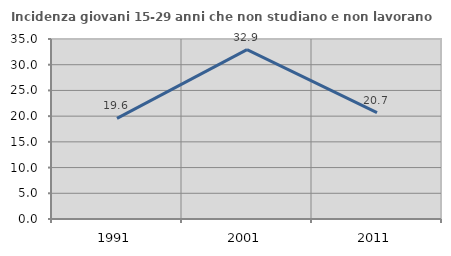
| Category | Incidenza giovani 15-29 anni che non studiano e non lavorano  |
|---|---|
| 1991.0 | 19.554 |
| 2001.0 | 32.919 |
| 2011.0 | 20.69 |